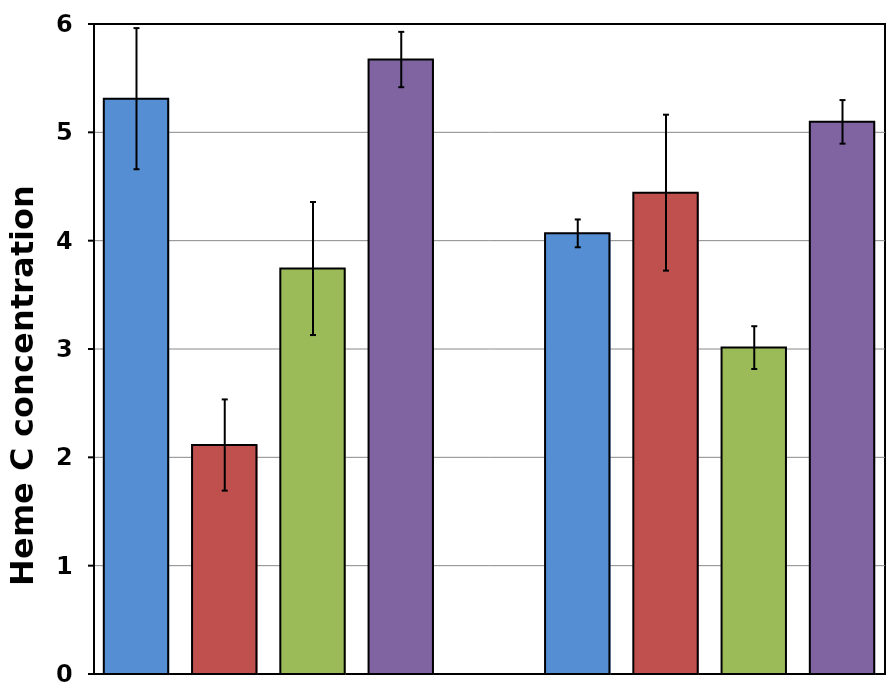
| Category | MR1/ev 4hr | 15/ev 4hr | MR1/phemA 4hr | 15/phemA 4hr | Series 4 | MR1/ev 8hr | 15/ev 8hr | MR1/phemA 8hr | 15/phemA 8hr |
|---|---|---|---|---|---|---|---|---|---|
| 0 | 5.311 | 2.114 | 3.743 | 5.672 |  | 4.067 | 4.443 | 3.013 | 5.097 |